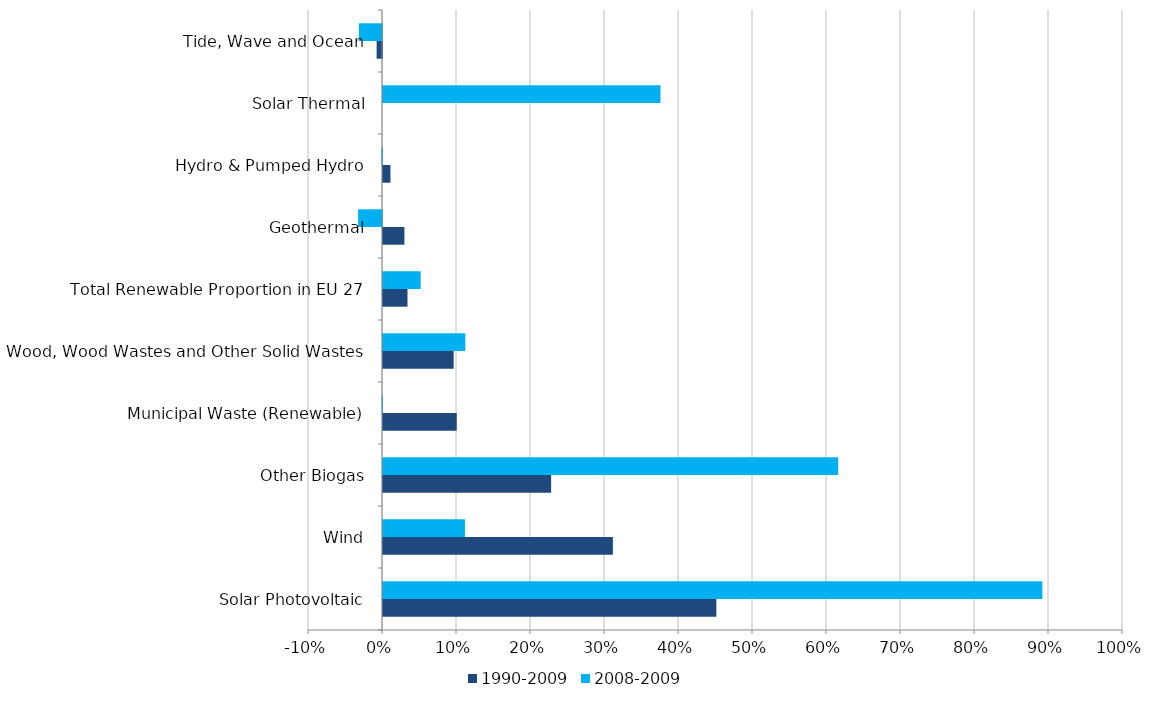
| Category | 1990-2009 | 2008-2009 |
|---|---|---|
| Solar Photovoltaic | 0.45 | 0.891 |
| Wind | 0.311 | 0.111 |
| Other Biogas | 0.227 | 0.615 |
| Municipal Waste (Renewable) | 0.1 | 0 |
| Wood, Wood Wastes and Other Solid Wastes | 0.096 | 0.111 |
| Total Renewable Proportion in EU 27 | 0.033 | 0.051 |
| Geothermal | 0.029 | -0.032 |
| Hydro & Pumped Hydro | 0.01 | -0.001 |
| Solar Thermal | 0 | 0.375 |
| Tide, Wave and Ocean | -0.007 | -0.031 |